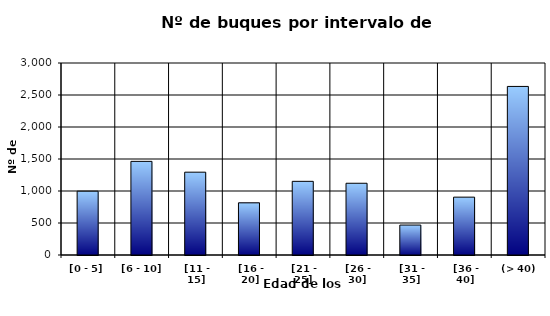
| Category | [0 - 5] |
|---|---|
| [0 - 5] | 997 |
|  [6 - 10] | 1463 |
|  [11 - 15] | 1294 |
|  [16 - 20] | 815 |
|  [21 - 25] | 1151 |
|  [26 - 30] | 1121 |
|  [31 - 35] | 468 |
|  [36 - 40] | 904 |
|  (> 40) | 2634 |